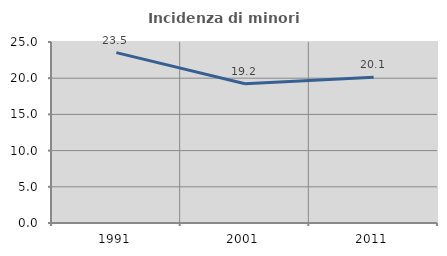
| Category | Incidenza di minori stranieri |
|---|---|
| 1991.0 | 23.529 |
| 2001.0 | 19.231 |
| 2011.0 | 20.118 |